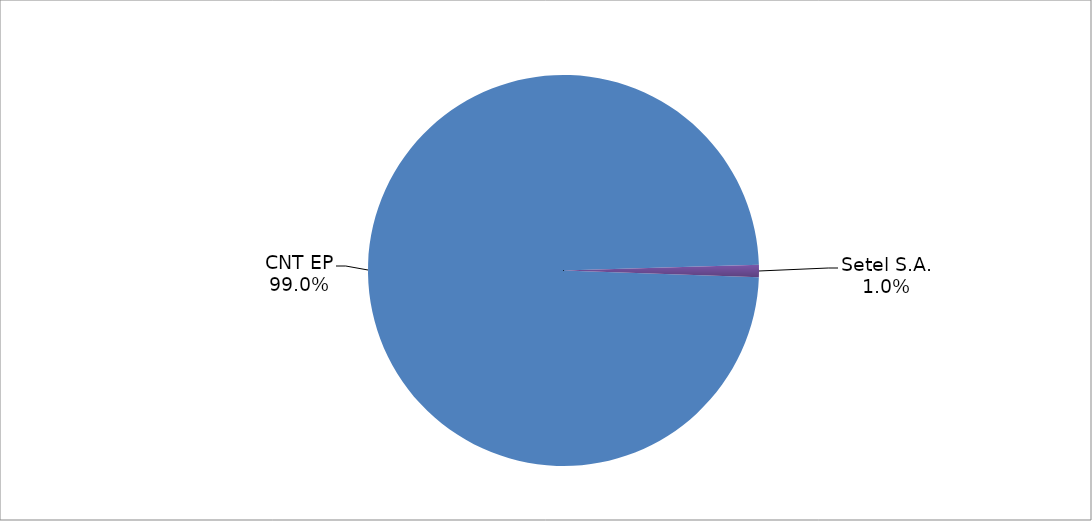
| Category | Series 0 |
|---|---|
| CNT EP | 288 |
| Setel S.A. | 3 |